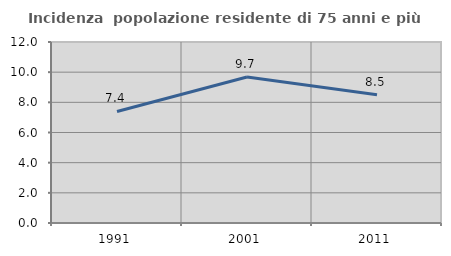
| Category | Incidenza  popolazione residente di 75 anni e più |
|---|---|
| 1991.0 | 7.396 |
| 2001.0 | 9.677 |
| 2011.0 | 8.503 |